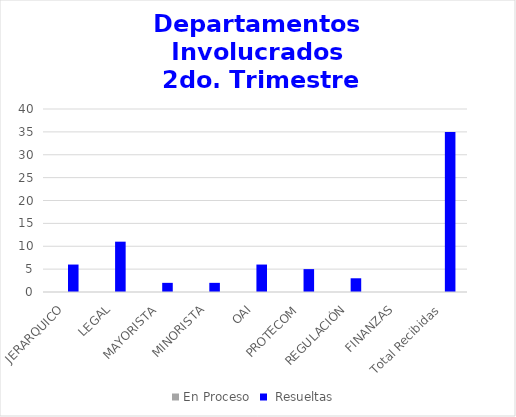
| Category | En Proceso |  Resueltas  |
|---|---|---|
| JERARQUICO | 0 | 6 |
| LEGAL | 0 | 11 |
| MAYORISTA | 0 | 2 |
| MINORISTA | 0 | 2 |
| OAI | 0 | 6 |
| PROTECOM | 0 | 5 |
| REGULACIÓN | 0 | 3 |
| FINANZAS | 0 | 0 |
| Total Recibidas | 0 | 35 |